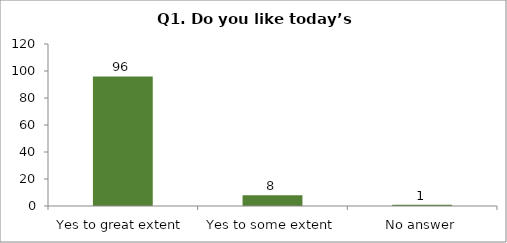
| Category | Q1. Do you like today’s session? |
|---|---|
| Yes to great extent | 96 |
| Yes to some extent | 8 |
| No answer | 1 |